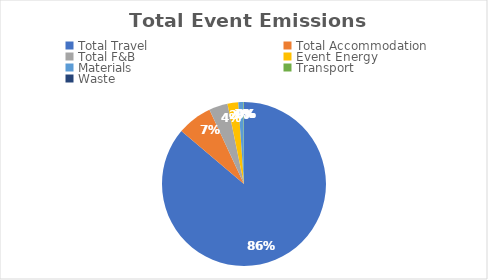
| Category | Series 0 |
|---|---|
| Total Travel | 17.06 |
| Total Accommodation | 1.37 |
| Total F&B | 0.73 |
| Event Energy | 0.42 |
| Materials | 0.2 |
| Transport | 0.02 |
| Waste | 0 |